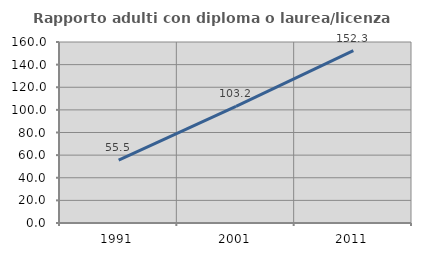
| Category | Rapporto adulti con diploma o laurea/licenza media  |
|---|---|
| 1991.0 | 55.513 |
| 2001.0 | 103.158 |
| 2011.0 | 152.347 |